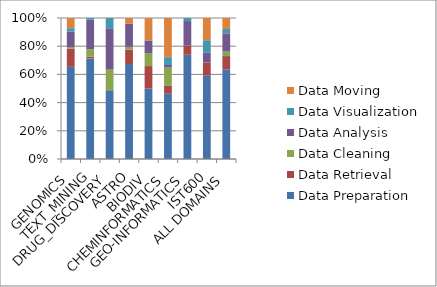
| Category | Data Preparation | Data Retrieval | Data Cleaning | Data Analysis | Data Visualization | Data Moving |
|---|---|---|---|---|---|---|
| GENOMICS | 308 | 61 | 5 | 52 | 11 | 34 |
| TEXT_MINING | 122 | 2 | 9 | 36 | 2 | 0 |
| DRUG_DISCOVERY | 20 | 0 | 6 | 12 | 3 | 0 |
| ASTRO | 33 | 5 | 1 | 8 | 0 | 2 |
| BIODIV | 22 | 7 | 4 | 4 | 0 | 7 |
| CHEMINFORMATICS | 25 | 3 | 7 | 1 | 3 | 15 |
| GEO-INFORMATICS | 34 | 3 | 0 | 8 | 1 | 0 |
| IST600 | 75 | 12 | 0 | 9 | 11 | 20 |
| ALL DOMAINS | 639 | 93 | 32 | 130 | 31 | 78 |